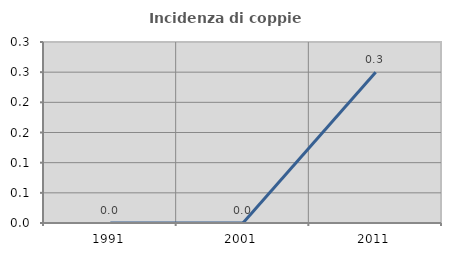
| Category | Incidenza di coppie miste |
|---|---|
| 1991.0 | 0 |
| 2001.0 | 0 |
| 2011.0 | 0.25 |